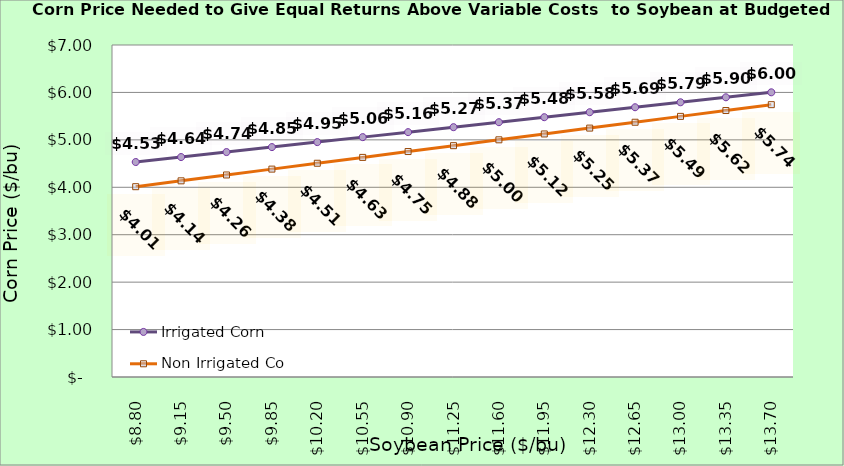
| Category | Irrigated Corn | Non Irrigated Corn |
|---|---|---|
| 8.800000000000002 | 4.533 | 4.013 |
| 9.150000000000002 | 4.638 | 4.136 |
| 9.500000000000002 | 4.743 | 4.26 |
| 9.850000000000001 | 4.848 | 4.383 |
| 10.200000000000001 | 4.953 | 4.507 |
| 10.55 | 5.058 | 4.63 |
| 10.9 | 5.163 | 4.754 |
| 11.25 | 5.268 | 4.877 |
| 11.6 | 5.373 | 5.001 |
| 11.95 | 5.478 | 5.124 |
| 12.299999999999999 | 5.583 | 5.248 |
| 12.649999999999999 | 5.688 | 5.371 |
| 12.999999999999998 | 5.793 | 5.495 |
| 13.349999999999998 | 5.898 | 5.618 |
| 13.699999999999998 | 6.003 | 5.742 |